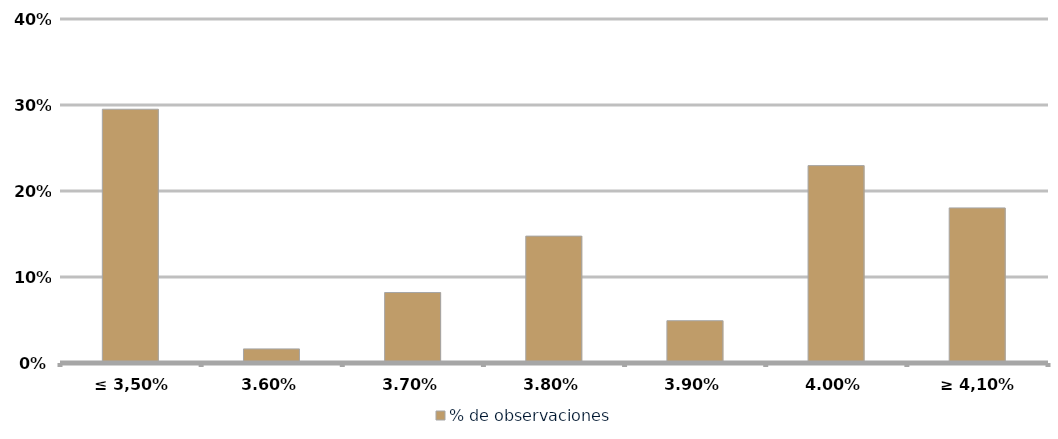
| Category | % de observaciones  |
|---|---|
|  ≤ 3,50%  | 0.295 |
| 3,60% | 0.016 |
| 3,70% | 0.082 |
| 3,80% | 0.148 |
| 3,90% | 0.049 |
| 4,00% | 0.23 |
| ≥ 4,10% | 0.18 |